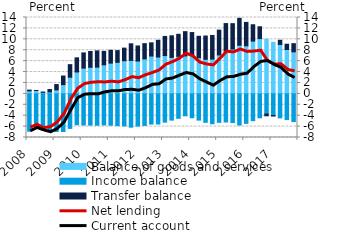
| Category | Balance of goods and services | Income balance | Transfer balance |
|---|---|---|---|
| 2008.0 | 0.542 | -6.855 | 0.144 |
| 2008.0 | 0.607 | -6.318 | 0.016 |
| 2008.0 | 0.276 | -6.627 | 0.057 |
| 2008.0 | 0.356 | -6.874 | 0.434 |
| 2009.0 | 0.725 | -6.896 | 0.982 |
| 2009.0 | 1.689 | -6.9 | 1.582 |
| 2009.0 | 3.052 | -6.333 | 2.306 |
| 2009.0 | 4.018 | -5.649 | 2.584 |
| 2010.0 | 4.723 | -5.709 | 2.785 |
| 2010.0 | 4.875 | -5.734 | 2.897 |
| 2010.0 | 4.906 | -5.753 | 2.976 |
| 2010.0 | 5.323 | -5.696 | 2.468 |
| 2011.0 | 5.632 | -5.751 | 2.353 |
| 2011.0 | 5.782 | -5.822 | 2.145 |
| 2011.0 | 6.075 | -5.873 | 2.309 |
| 2011.0 | 6.133 | -6.11 | 3.044 |
| 2012.0 | 6.016 | -5.905 | 2.764 |
| 2012.0 | 6.423 | -5.787 | 2.783 |
| 2012.0 | 6.938 | -5.537 | 2.417 |
| 2012.0 | 6.753 | -5.533 | 3.069 |
| 2013.0 | 7.019 | -5.186 | 3.511 |
| 2013.0 | 6.687 | -4.813 | 3.957 |
| 2013.0 | 6.877 | -4.482 | 4.041 |
| 2013.0 | 6.964 | -4.021 | 4.439 |
| 2014.0 | 7.045 | -4.377 | 4.196 |
| 2014.0 | 6.644 | -4.812 | 3.911 |
| 2014.0 | 6.34 | -5.216 | 4.266 |
| 2014.0 | 6.376 | -5.477 | 4.328 |
| 2015.0 | 7.133 | -5.219 | 4.55 |
| 2015.0 | 7.828 | -5.159 | 5.057 |
| 2015.0 | 8.226 | -5.27 | 4.646 |
| 2015.0 | 8.908 | -5.712 | 4.937 |
| 2016.0 | 8.812 | -5.41 | 4.288 |
| 2016.0 | 9.679 | -4.913 | 2.992 |
| 2016.0 | 10.136 | -4.389 | 2.166 |
| 2016.0 | 10.012 | -3.705 | -0.312 |
| 2017.0 | 9.451 | -3.977 | -0.089 |
| 2017.0 | 9.056 | -4.403 | 0.771 |
| 2017.0 | 8.135 | -4.714 | 0.964 |
| 2017.0 | 7.706 | -5.071 | 1.499 |